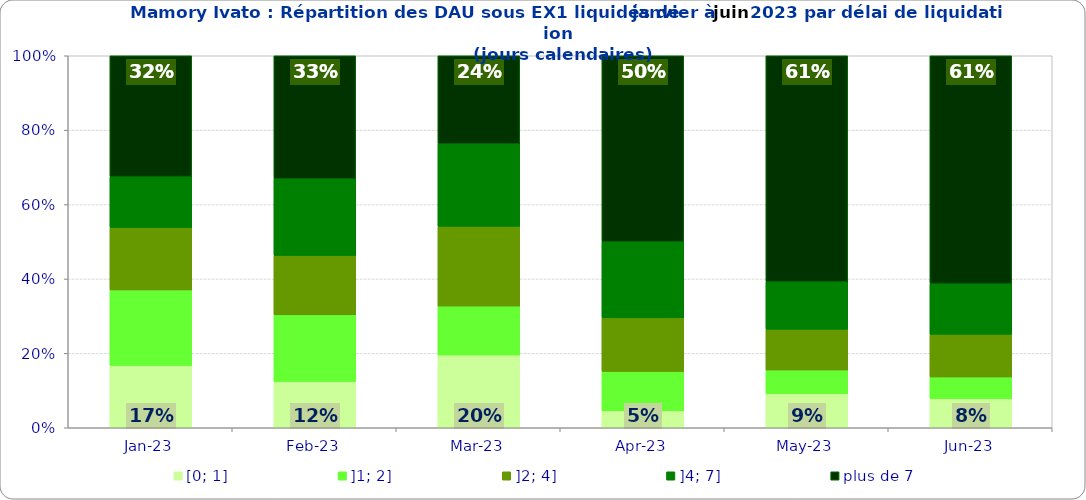
| Category | [0; 1] | ]1; 2] | ]2; 4] | ]4; 7] | plus de 7 |
|---|---|---|---|---|---|
| 2023-01-01 | 0.168 | 0.203 | 0.168 | 0.137 | 0.325 |
| 2023-02-01 | 0.125 | 0.179 | 0.16 | 0.206 | 0.331 |
| 2023-03-01 | 0.195 | 0.132 | 0.214 | 0.222 | 0.237 |
| 2023-04-01 | 0.045 | 0.106 | 0.144 | 0.205 | 0.5 |
| 2023-05-01 | 0.091 | 0.064 | 0.11 | 0.128 | 0.607 |
| 2023-06-01 | 0.078 | 0.059 | 0.115 | 0.137 | 0.612 |